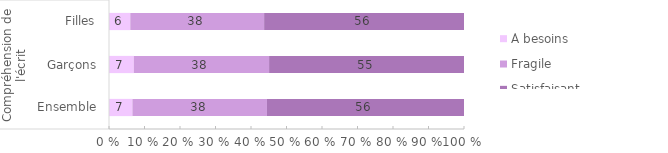
| Category | À besoins | Fragile | Satisfaisant |
|---|---|---|---|
| 0 | 6.6 | 37.9 | 55.5 |
| 1 | 7 | 38.1 | 54.9 |
| 2 | 6 | 37.7 | 56.3 |